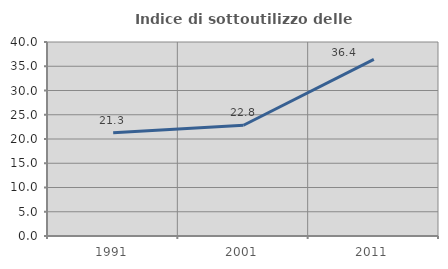
| Category | Indice di sottoutilizzo delle abitazioni  |
|---|---|
| 1991.0 | 21.277 |
| 2001.0 | 22.832 |
| 2011.0 | 36.413 |